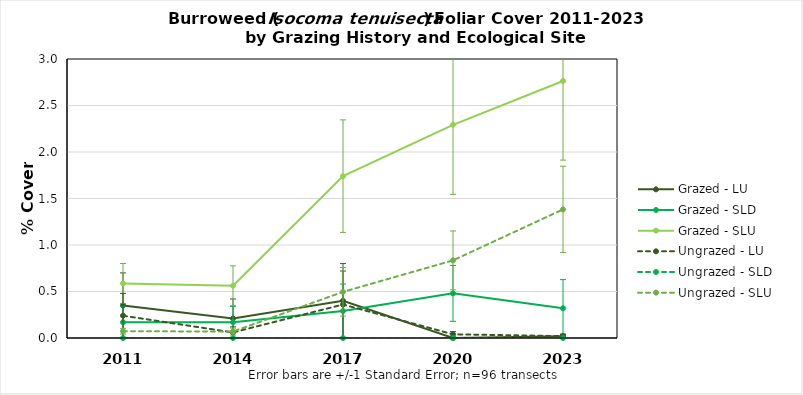
| Category | Grazed - LU | Grazed - SLD | Grazed - SLU | Ungrazed - LU | Ungrazed - SLD | Ungrazed - SLU |
|---|---|---|---|---|---|---|
| 2011.0 | 0.35 | 0.17 | 0.587 | 0.24 | 0 | 0.073 |
| 2014.0 | 0.21 | 0.17 | 0.562 | 0.06 | 0 | 0.069 |
| 2017.0 | 0.4 | 0.29 | 1.74 | 0.36 | 0 | 0.496 |
| 2020.0 | 0 | 0.48 | 2.292 | 0.04 | 0 | 0.835 |
| 2023.0 | 0.02 | 0.32 | 2.763 | 0.02 | 0 | 1.383 |